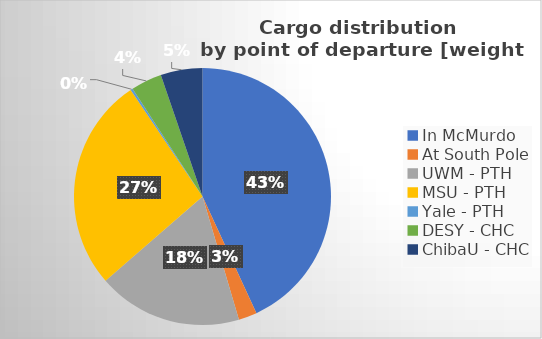
| Category | Series 0 |
|---|---|
| In McMurdo | 227787 |
| At South Pole | 12241 |
| UWM - PTH | 96104 |
| MSU - PTH | 142439 |
| Yale - PTH | 1500 |
| DESY - CHC | 20585 |
| ChibaU - CHC | 27780 |